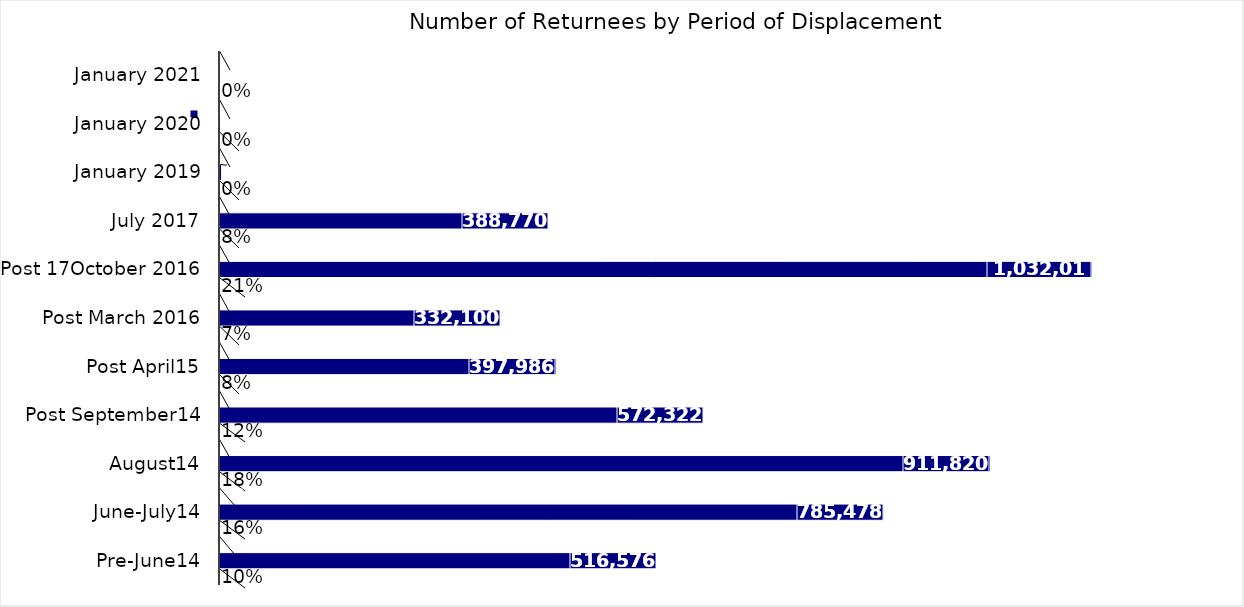
| Category | Sum of % | Sum of Returnees Individuals  | Sum of rank |
|---|---|---|---|
| Pre-June14 | 0.105 | 516576 | 11 |
| June-July14 | 0.159 | 785478 | 10 |
| August14 | 0.185 | 911820 | 9 |
| Post September14 | 0.116 | 572322 | 8 |
| Post April15 | 0.081 | 397986 | 7 |
| Post March 2016 | 0.067 | 332100 | 6 |
| Post 17October 2016 | 0.209 | 1032012 | 5 |
| July 2017 | 0.079 | 388770 | 4 |
| January 2019 | 0 | 1890 | 3 |
| January 2020 | 0 | 120 | 2 |
| January 2021 | 0 | 0 | 1 |